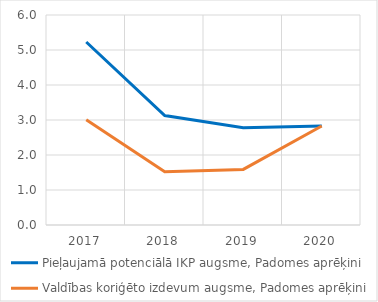
| Category | Pieļaujamā potenciālā IKP augsme, Padomes aprēķini | Valdības koriģēto izdevum augsme, Padomes aprēķini |
|---|---|---|
| 2017.0 | 5.228 | 3.004 |
| 2018.0 | 3.127 | 1.524 |
| 2019.0 | 2.776 | 1.588 |
| 2020.0 | 2.83 | 2.83 |